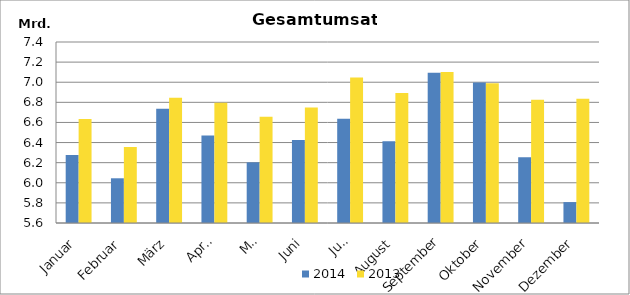
| Category | 2014 | 2013 |
|---|---|---|
| Januar | 6275001.704 | 6634598.792 |
| Februar | 6044673.306 | 6356666.686 |
| März | 6735924.712 | 6845200.236 |
| April | 6470727.723 | 6795767.671 |
| Mai | 6203139.46 | 6656105.832 |
| Juni | 6425656.835 | 6748696.078 |
| Juli | 6637089.136 | 7047916.442 |
| August | 6414113.116 | 6892924.225 |
| September | 7093739.171 | 7101182.735 |
| Oktober | 6996691.503 | 6988859.096 |
| November | 6253803.728 | 6826060.87 |
| Dezember | 5807838.059 | 6835254.617 |